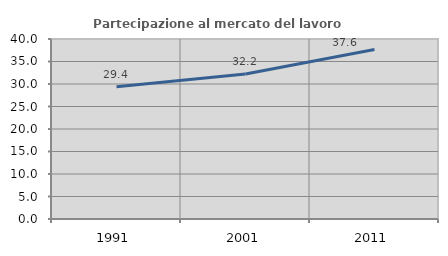
| Category | Partecipazione al mercato del lavoro  femminile |
|---|---|
| 1991.0 | 29.384 |
| 2001.0 | 32.22 |
| 2011.0 | 37.646 |